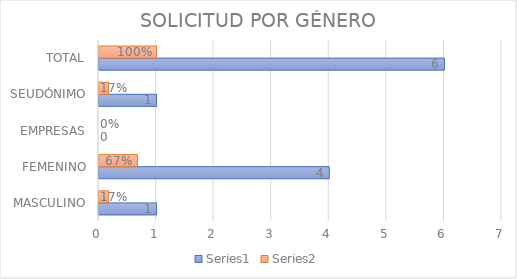
| Category | Series 0 | Series 1 |
|---|---|---|
| MASCULINO | 1 | 0.167 |
| FEMENINO | 4 | 0.667 |
| EMPRESAS | 0 | 0 |
| SEUDÓNIMO | 1 | 0.167 |
| TOTAL | 6 | 1 |